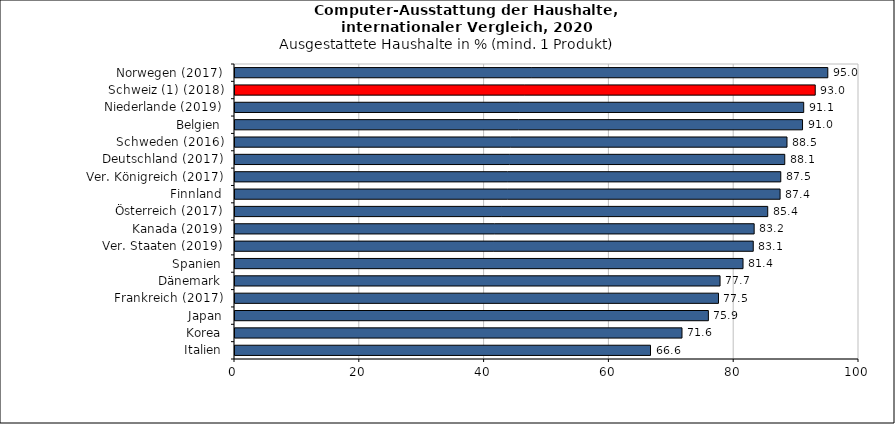
| Category | Italien |
|---|---|
| Italien | 66.588 |
| Korea | 71.633 |
| Japan | 75.863 |
| Frankreich (2017) | 77.483 |
| Dänemark | 77.732 |
| Spanien | 81.415 |
| Ver. Staaten (2019) | 83.054 |
| Kanada (2019) | 83.199 |
| Österreich (2017) | 85.373 |
| Finnland | 87.355 |
| Ver. Königreich (2017) | 87.464 |
| Deutschland (2017) | 88.102 |
| Schweden (2016) | 88.46 |
| Belgien | 90.953 |
| Niederlande (2019) | 91.139 |
| Schweiz (1) (2018) | 92.988 |
| Norwegen (2017) | 95 |